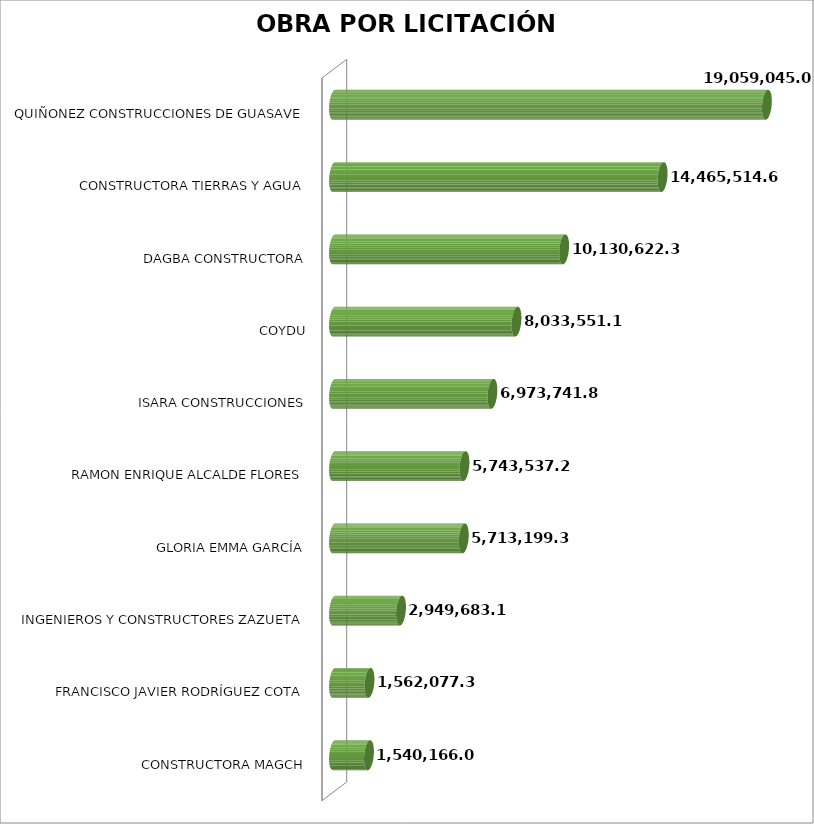
| Category | Monto  |
|---|---|
| CONSTRUCTORA MAGCH | 1540166.01 |
| FRANCISCO JAVIER RODRÍGUEZ COTA | 1562077.37 |
| INGENIEROS Y CONSTRUCTORES ZAZUETA | 2949683.11 |
| GLORIA EMMA GARCÍA | 5713199.3 |
| RAMON ENRIQUE ALCALDE FLORES | 5743537.26 |
| ISARA CONSTRUCCIONES | 6973741.81 |
| COYDU | 8033551.11 |
| DAGBA CONSTRUCTORA | 10130622.31 |
| CONSTRUCTORA TIERRAS Y AGUA | 14465514.66 |
| QUIÑONEZ CONSTRUCCIONES DE GUASAVE | 19059045 |